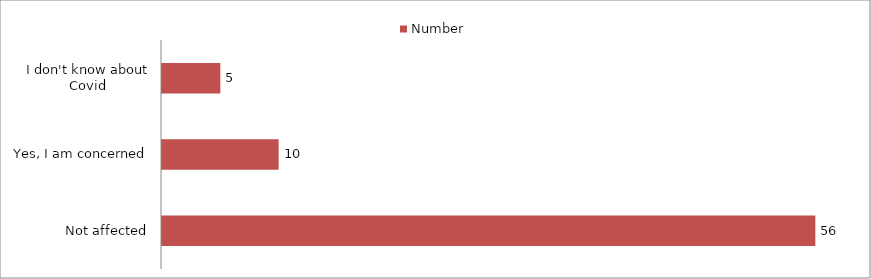
| Category | Number |
|---|---|
| Not affected | 56 |
| Yes, I am concerned | 10 |
| I don't know about Covid | 5 |